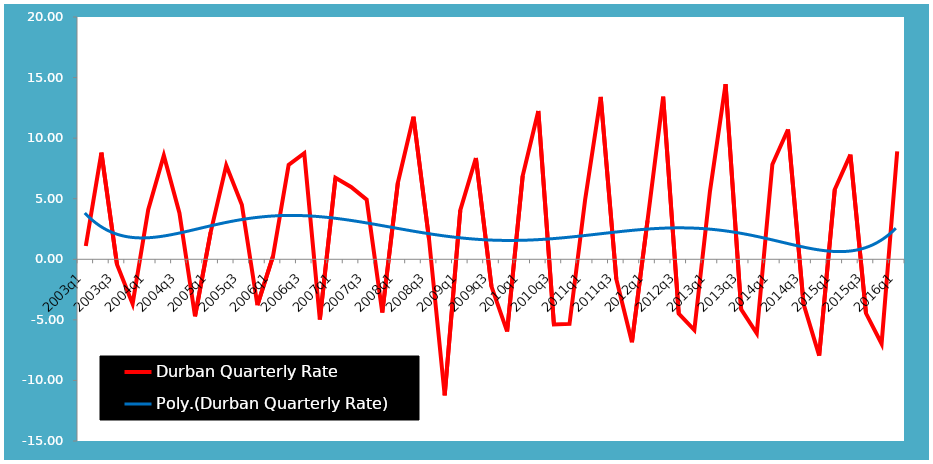
| Category | Durban Quarterly Rate |
|---|---|
| 2003q1 | 1.098 |
| 2003q2 | 8.804 |
| 2003q3 | -0.426 |
| 2003q4 | -3.68 |
| 2004q1 | 4.091 |
| 2004q2 | 8.565 |
| 2004q3 | 3.826 |
| 2004q4 | -4.708 |
| 2005q1 | 2.222 |
| 2005q2 | 7.753 |
| 2005q3 | 4.504 |
| 2005q4 | -3.79 |
| 2006q1 | 0.268 |
| 2006q2 | 7.797 |
| 2006q3 | 8.753 |
| 2006q4 | -4.973 |
| 2007q1 | 6.736 |
| 2007q2 | 5.975 |
| 2007q3 | 4.922 |
| 2007q4 | -4.398 |
| 2008q1 | 6.324 |
| 2008q2 | 11.775 |
| 2008q3 | 1.625 |
| 2008q4 | -11.237 |
| 2009q1 | 4.05 |
| 2009q2 | 8.364 |
| 2009q3 | -2.257 |
| 2009q4 | -5.958 |
| 2010q1 | 6.888 |
| 2010q2 | 12.24 |
| 2010q3 | -5.378 |
| 2010q4 | -5.334 |
| 2011q1 | 4.917 |
| 2011q2 | 13.402 |
| 2011q3 | -1.637 |
| 2011q4 | -6.842 |
| 2012q1 | 3.211 |
| 2012q2 | 13.419 |
| 2012q3 | -4.492 |
| 2012q4 | -5.842 |
| 2013q1 | 5.609 |
| 2013q2 | 14.455 |
| 2013q3 | -4.125 |
| 2013q4 | -6.119 |
| 2014q1 | 7.831 |
| 2014q2 | 10.713 |
| 2014q3 | -3.705 |
| 2014q4 | -7.954 |
| 2015q1 | 5.761 |
| 2015q2 | 8.644 |
| 2015q3 | -4.459 |
| 2015q4 | -6.975 |
| 2016q1 | 8.913 |